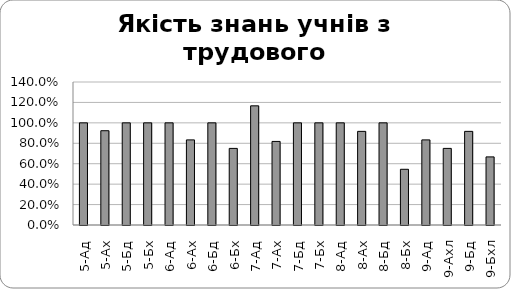
| Category | Series 0 |
|---|---|
| 5-Ад | 1 |
| 5-Ах | 0.923 |
| 5-Бд | 1 |
| 5-Бх | 1 |
| 6-Ад | 1 |
| 6-Ах | 0.833 |
| 6-Бд | 1 |
| 6-Бх | 0.75 |
| 7-Ад | 1.167 |
| 7-Ах | 0.818 |
| 7-Бд | 1 |
| 7-Бх | 1 |
| 8-Ад | 1 |
| 8-Ах | 0.917 |
| 8-Бд | 1 |
| 8-Бх | 0.545 |
| 9-Ад | 0.833 |
| 9-Ахл | 0.75 |
| 9-Бд | 0.917 |
| 9-Бхл | 0.667 |